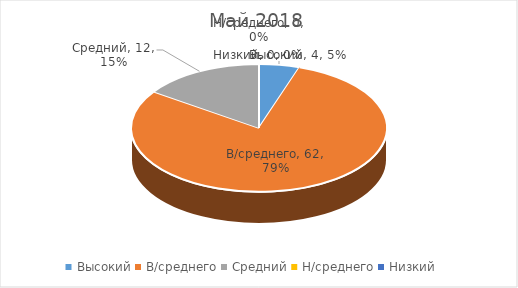
| Category | Май 2018 |
|---|---|
| Высокий | 4 |
| В/среднего | 62 |
| Средний | 12 |
| Н/среднего | 0 |
| Низкий | 0 |